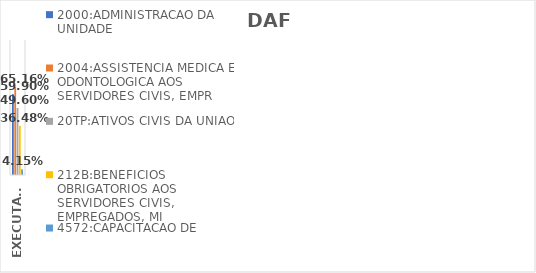
| Category | 2000:ADMINISTRACAO DA UNIDADE | 2004:ASSISTENCIA MEDICA E ODONTOLOGICA AOS SERVIDORES CIVIS, EMPR | 20TP:ATIVOS CIVIS DA UNIAO | 212B:BENEFICIOS OBRIGATORIOS AOS SERVIDORES CIVIS, EMPREGADOS, MI | 4572:CAPACITACAO DE SERVIDORES PUBLICOS FEDERAIS EM PROCESSO DE Q |
|---|---|---|---|---|---|
| EXECUTADO | 0.599 | 0.652 | 0.496 | 0.365 | 0.042 |